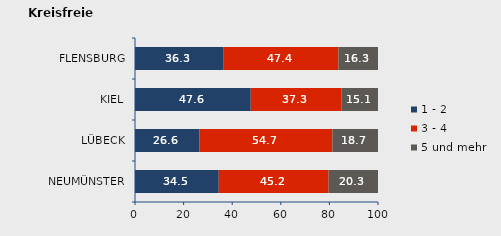
| Category | 1 - 2 | 3 - 4 | 5 und mehr |
|---|---|---|---|
| NEUMÜNSTER | 34.463 | 45.198 | 20.339 |
| LÜBECK | 26.57 | 54.686 | 18.744 |
| KIEL | 47.629 | 37.284 | 15.086 |
| FLENSBURG | 36.286 | 47.429 | 16.286 |